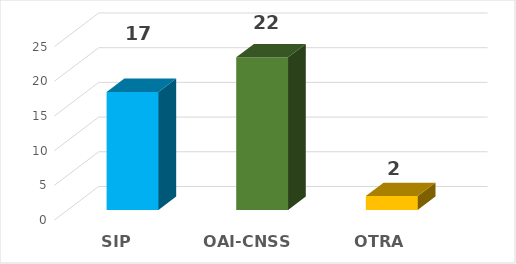
| Category | Series 0 |
|---|---|
| SIP | 17 |
| OAI-CNSS | 22 |
| OTRA ENTIDAD | 2 |